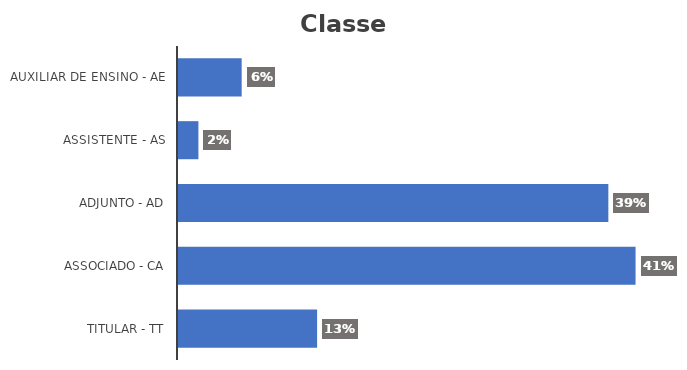
| Category | Series 0 |
|---|---|
| Titular - TT | 0.125 |
| Associado - CA | 0.412 |
| Adjunto - AD | 0.387 |
| Assistente - AS | 0.018 |
| Auxiliar de Ensino - AE | 0.057 |